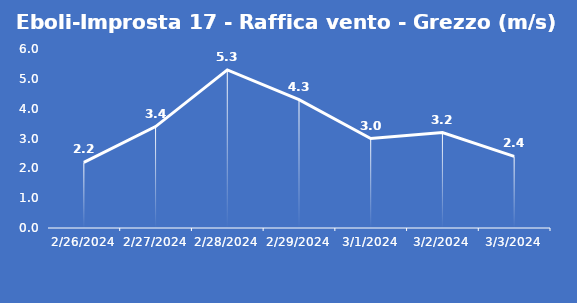
| Category | Eboli-Improsta 17 - Raffica vento - Grezzo (m/s) |
|---|---|
| 2/26/24 | 2.2 |
| 2/27/24 | 3.4 |
| 2/28/24 | 5.3 |
| 2/29/24 | 4.3 |
| 3/1/24 | 3 |
| 3/2/24 | 3.2 |
| 3/3/24 | 2.4 |